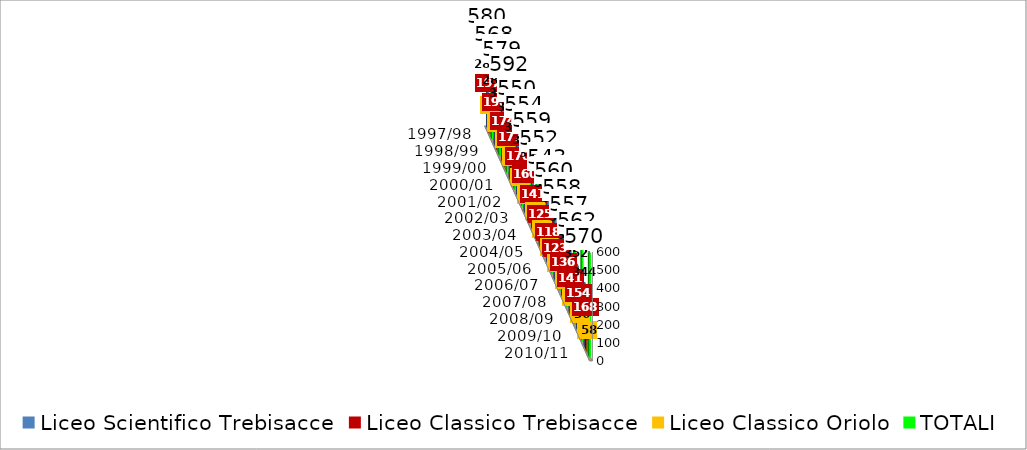
| Category | Liceo Scientifico Trebisacce | Liceo Classico Trebisacce | Liceo Classico Oriolo | TOTALI |
|---|---|---|---|---|
| 1997/98 | 288 | 197 | 95 | 580 |
| 1998/99 | 288 | 190 | 90 | 568 |
| 1999/00 | 313 | 174 | 92 | 579 |
| 2000/01 | 327 | 177 | 88 | 592 |
| 2001/02 | 310 | 170 | 70 | 550 |
| 2002/03 | 330 | 160 | 64 | 554 |
| 2003/04 | 353 | 141 | 65 | 559 |
| 2004/05 | 365 | 125 | 62 | 552 |
| 2005/06 | 370 | 118 | 55 | 543 |
| 2006/07 | 378 | 123 | 59 | 560 |
| 2007/08 | 366 | 136 | 56 | 558 |
| 2008/09 | 360 | 141 | 56 | 557 |
| 2009/10 | 352 | 154 | 56 | 562 |
| 2010/11 | 344 | 168 | 58 | 570 |